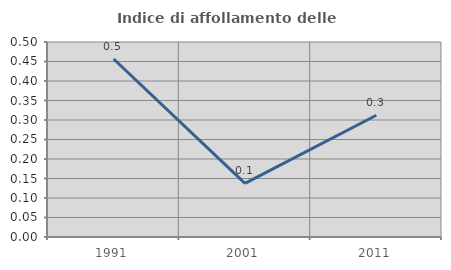
| Category | Indice di affollamento delle abitazioni  |
|---|---|
| 1991.0 | 0.456 |
| 2001.0 | 0.137 |
| 2011.0 | 0.312 |